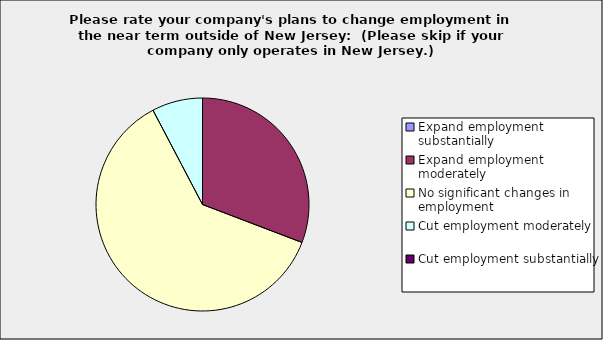
| Category | Series 0 |
|---|---|
| Expand employment substantially | 0 |
| Expand employment moderately | 0.308 |
| No significant changes in employment | 0.615 |
| Cut employment moderately | 0.077 |
| Cut employment substantially | 0 |